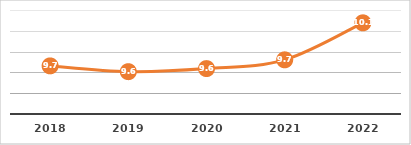
| Category | ALUMNOS POR COMPUTADORA (%) |
|---|---|
| 2018.0 | 9.663 |
| 2019.0 | 9.607 |
| 2020.0 | 9.637 |
| 2021.0 | 9.721 |
| 2022.0 | 10.077 |